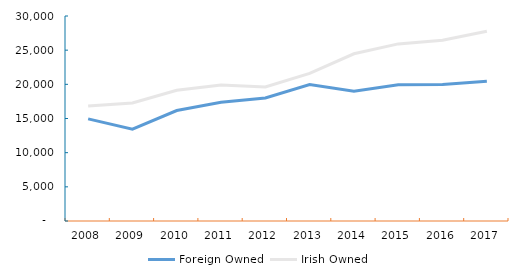
| Category | Foreign Owned | Irish Owned |
|---|---|---|
| 2008.0 | 14942 | 16817 |
| 2009.0 | 13447 | 17275 |
| 2010.0 | 16167 | 19135 |
| 2011.0 | 17367 | 19914 |
| 2012.0 | 18003 | 19611 |
| 2013.0 | 19974 | 21595 |
| 2014.0 | 19001 | 24472 |
| 2015.0 | 19954 | 25920 |
| 2016.0 | 19976 | 26449 |
| 2017.0 | 20445 | 27776 |